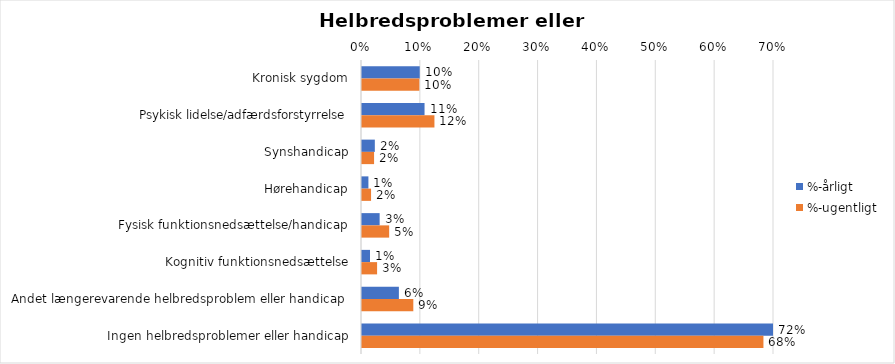
| Category | %-årligt | %-ugentligt |
|---|---|---|
| Kronisk sygdom | 0.098 | 0.097 |
| Psykisk lidelse/adfærdsforstyrrelse | 0.106 | 0.123 |
| Synshandicap | 0.022 | 0.021 |
| Hørehandicap | 0.011 | 0.015 |
| Fysisk funktionsnedsættelse/handicap | 0.03 | 0.046 |
| Kognitiv funktionsnedsættelse | 0.014 | 0.026 |
| Andet længerevarende helbredsproblem eller handicap  | 0.063 | 0.087 |
| Ingen helbredsproblemer eller handicap | 0.722 | 0.682 |